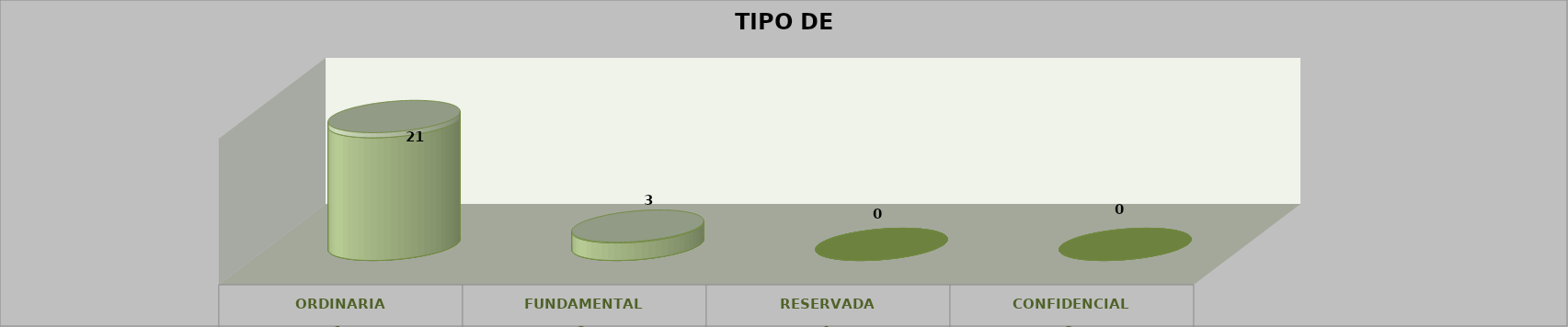
| Category | Series 0 | Series 2 | Series 1 | Series 3 | Series 4 |
|---|---|---|---|---|---|
| 0 |  |  |  | 21 | 0.875 |
| 1 |  |  |  | 3 | 0.125 |
| 2 |  |  |  | 0 | 0 |
| 3 |  |  |  | 0 | 0 |